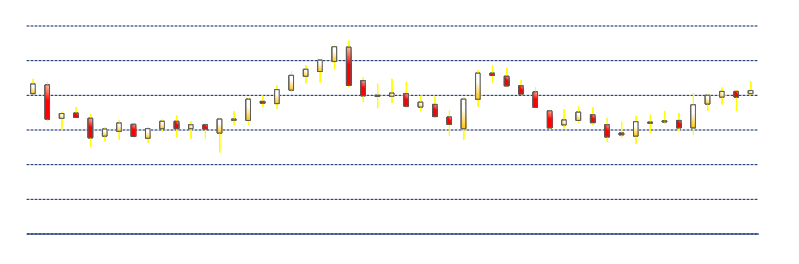
| Category | Series 0 | Series 1 | Series 2 | Series 3 |
|---|---|---|---|---|
| 1/19/16 | 881 | 888 | 880.5 | 882.75 |
| 1/15/16 | 882.25 | 882.75 | 871 | 879 |
| 1/14/16 | 879 | 884.5 | 874.75 | 882.25 |
| 1/13/16 | 875 | 880.75 | 871 | 880 |
| 1/12/16 | 861.25 | 881.25 | 857.25 | 874.5 |
| 1/11/16 | 865.5 | 869.75 | 859.5 | 861.25 |
| 1/8/16 | 865 | 871 | 863.5 | 865.25 |
| 1/7/16 | 864.5 | 868.75 | 858.25 | 864.5 |
| 1/6/16 | 856.5 | 868 | 852 | 864.75 |
| 1/5/16 | 858.25 | 864.75 | 855.5 | 857.25 |
| 1/4/16 | 863 | 867 | 853.25 | 856 |
| 12/31/15 | 868.75 | 873 | 863 | 864.25 |
| 12/30/15 | 865.5 | 873.5 | 864 | 870.25 |
| 12/29/15 | 863 | 872 | 861 | 865.75 |
| 12/28/15 | 871 | 871.5 | 860.5 | 861.25 |
| 12/24/15 | 882 | 884.5 | 872.75 | 873 |
| 12/23/15 | 885.5 | 888.75 | 880.25 | 880.75 |
| 12/22/15 | 891 | 895.5 | 885.25 | 885.5 |
| 12/21/15 | 892.75 | 897 | 887.5 | 891.5 |
| 12/18/15 | 877.75 | 894.5 | 873.5 | 892.75 |
| 12/17/15 | 860.75 | 879 | 854.25 | 877.75 |
| 12/16/15 | 867.5 | 871.25 | 856.75 | 863.25 |
| 12/15/15 | 874.75 | 879.25 | 867 | 867.75 |
| 12/14/15 | 873.25 | 879.75 | 870.75 | 876 |
| 12/11/15 | 881 | 887.75 | 873 | 873.75 |
| 12/10/15 | 879.5 | 889.5 | 875.75 | 881.25 |
| 12/9/15 | 880 | 886.75 | 872.5 | 879.75 |
| 12/8/15 | 888.5 | 890.25 | 876.25 | 879.75 |
| 12/7/15 | 907.75 | 911.5 | 884.75 | 885.75 |
| 12/4/15 | 899.5 | 908.5 | 895 | 908 |
| 12/3/15 | 893.75 | 900.5 | 887.5 | 900.25 |
| 12/2/15 | 891 | 897.25 | 887 | 895 |
| 12/1/15 | 883 | 894 | 881.75 | 891.5 |
| 11/30/15 | 875.25 | 885.75 | 872.25 | 883.25 |
| 11/27/15 | 876.5 | 879.75 | 873.5 | 875.5 |
| 11/25/15 | 865.5 | 878.5 | 863.25 | 877.75 |
| 11/24/15 | 866 | 870.75 | 863 | 866.25 |
| 11/23/15 | 858.25 | 867 | 847 | 866.25 |
| 11/20/15 | 863 | 863.75 | 855.25 | 860.5 |
| 11/19/15 | 860.75 | 865 | 855 | 863 |
| 11/18/15 | 865 | 868.5 | 855.75 | 860.75 |
| 11/17/15 | 860.75 | 866 | 859 | 865 |
| 11/16/15 | 855.25 | 861.5 | 852.75 | 860.75 |
| 11/13/15 | 863.25 | 863.25 | 855.5 | 856.25 |
| 11/12/15 | 859.25 | 865.75 | 854.25 | 864 |
| 11/11/15 | 856.5 | 861.5 | 853.5 | 860.5 |
| 11/10/15 | 866.75 | 869.25 | 850.5 | 855.5 |
| 11/9/15 | 869.75 | 873.25 | 867 | 867.25 |
| 11/6/15 | 866.75 | 870.5 | 860.25 | 869.5 |
| 11/5/15 | 886 | 887.5 | 865.25 | 866.25 |
| 11/4/15 | 881 | 889.5 | 881 | 886.5 |